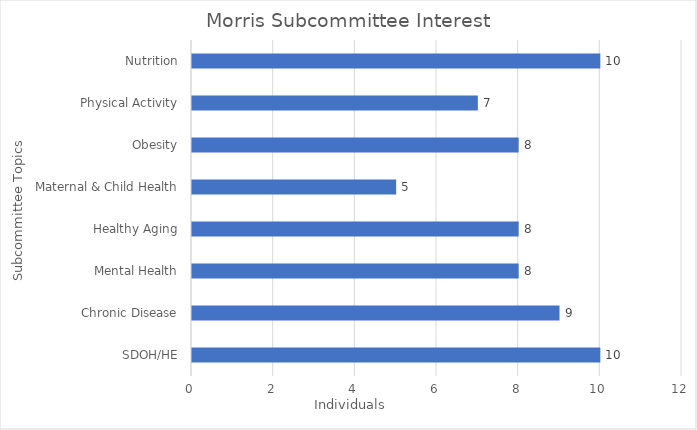
| Category | Individuals |
|---|---|
| SDOH/HE | 10 |
| Chronic Disease | 9 |
| Mental Health | 8 |
| Healthy Aging | 8 |
| Maternal & Child Health | 5 |
| Obesity | 8 |
| Physical Activity | 7 |
| Nutrition | 10 |